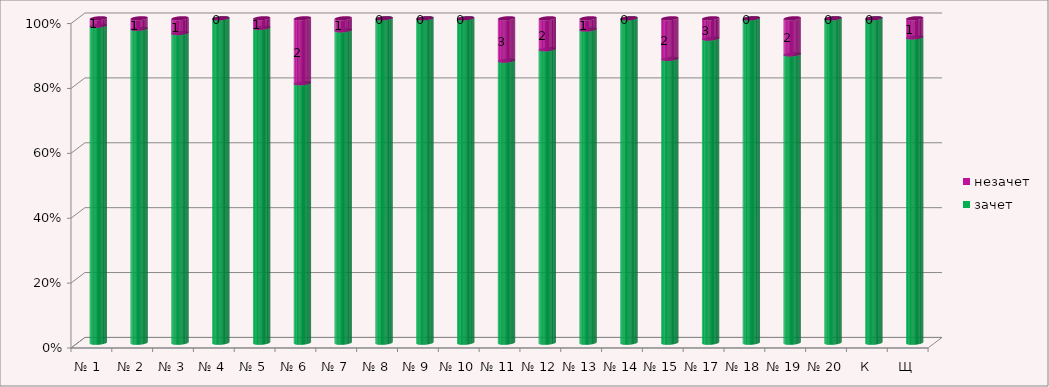
| Category | зачет | незачет |
|---|---|---|
| № 1  | 43 | 1 |
| № 2 | 30 | 1 |
| № 3 | 21 | 1 |
| № 4 | 18 | 0 |
| № 5 | 33 | 1 |
| № 6 | 8 | 2 |
| № 7 | 26 | 1 |
| № 8 | 14 | 0 |
| № 9 | 25 | 0 |
| № 10 | 15 | 0 |
| № 11 | 20 | 3 |
| № 12 | 19 | 2 |
| № 13 | 28 | 1 |
| № 14 | 24 | 0 |
| № 15 | 14 | 2 |
| № 17 | 45 | 3 |
| № 18 | 4 | 0 |
| № 19 | 16 | 2 |
| № 20 | 14 | 0 |
| К | 13 | 0 |
| Щ | 16 | 1 |